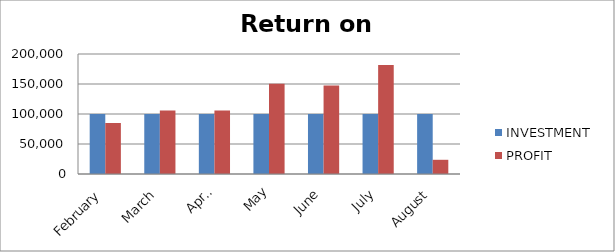
| Category | INVESTMENT  | PROFIT |
|---|---|---|
| February | 100000 | 85042 |
| March | 100000 | 105720 |
| April | 100000 | 105795 |
| May | 100000 | 150579 |
| June | 100000 | 147454 |
| July | 100000 | 181784 |
| August | 100000 | 23677 |